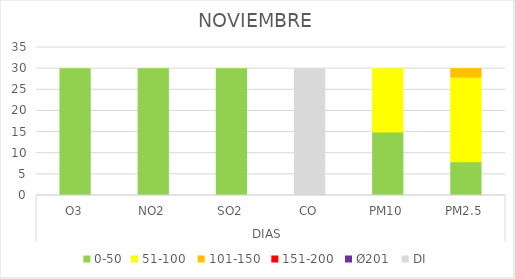
| Category | 0-50 | 51-100  | 101-150  | 151-200  | Ø201  | DI |
|---|---|---|---|---|---|---|
| 0 | 30 | 0 | 0 | 0 | 0 | 0 |
| 1 | 30 | 0 | 0 | 0 | 0 | 0 |
| 2 | 30 | 0 | 0 | 0 | 0 | 0 |
| 3 | 0 | 0 | 0 | 0 | 0 | 30 |
| 4 | 15 | 15 | 0 | 0 | 0 | 0 |
| 5 | 8 | 20 | 2 | 0 | 0 | 0 |